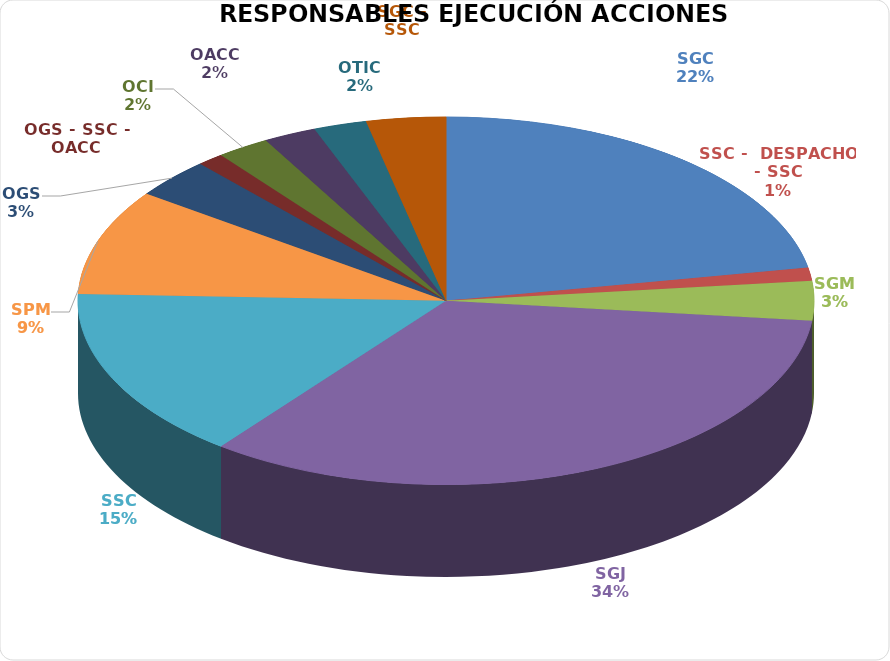
| Category | Series 0 |
|---|---|
| SGC | 19 |
| SSC -  DESPACHO - SSC | 1 |
| SGM | 3 |
| SGJ | 29 |
| SSC | 13 |
| SPM | 8 |
| OGS | 3 |
| OGS - SSC - OACC | 1 |
| OCI | 2 |
| OACC | 2 |
| OTIC | 2 |
| SGC - SSC | 3 |